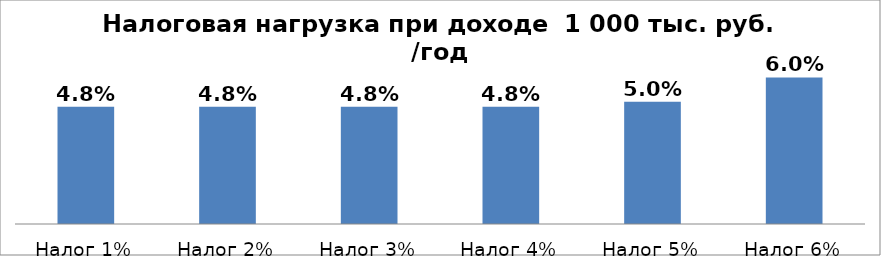
| Category | Налоговая нагрузка |
|---|---|
| Налог 1% | 0.048 |
| Налог 2% | 0.048 |
| Налог 3% | 0.048 |
| Налог 4% | 0.048 |
| Налог 5% | 0.05 |
| Налог 6% | 0.06 |